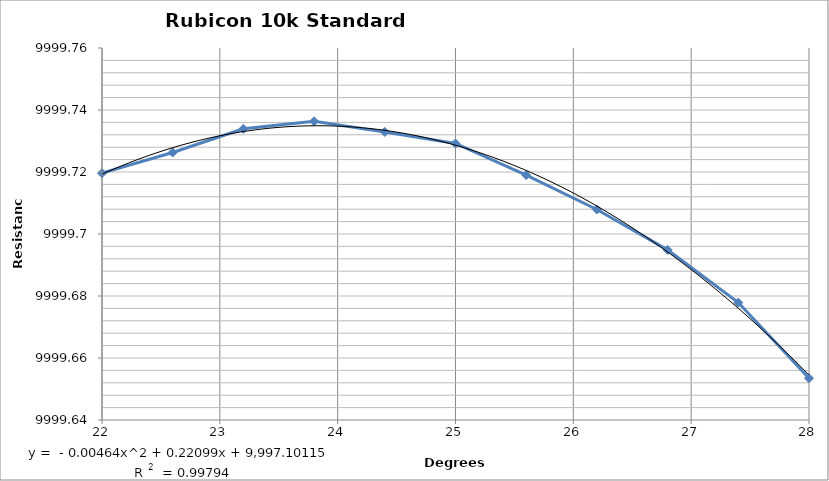
| Category | YArray1 |
|---|---|
| 22.0 | 9999.72 |
| 22.600000023841858 | 9999.726 |
| 23.200000047683716 | 9999.734 |
| 23.800000071525574 | 9999.736 |
| 24.40000009536743 | 9999.733 |
| 25.00000011920929 | 9999.729 |
| 25.600000143051147 | 9999.719 |
| 26.200000166893005 | 9999.708 |
| 26.800000190734863 | 9999.695 |
| 27.40000021457672 | 9999.678 |
| 28.00000023841858 | 9999.653 |